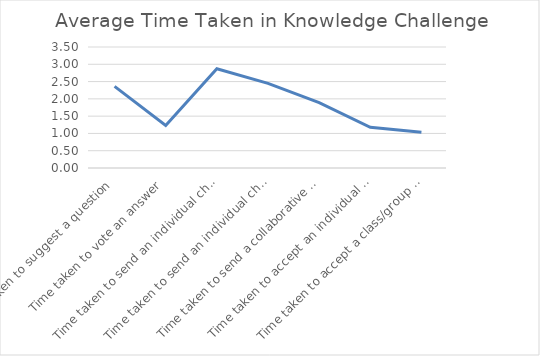
| Category | Series 0 |
|---|---|
| Time taken to suggest a question | 2.359 |
| Time taken to vote an answer | 1.232 |
| Time taken to send an individual challenge to another user | 2.869 |
| Time taken to send an individual challenge to another group | 2.447 |
| Time taken to send a collaborative challenge | 1.894 |
| Time taken to accept an individual challenge | 1.178 |
| Time taken to accept a class/group challenge | 1.037 |